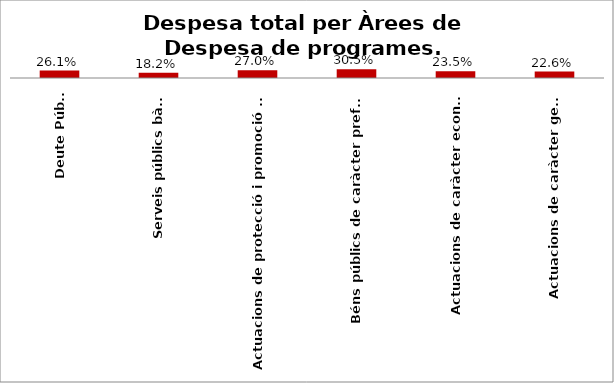
| Category | Series 0 |
|---|---|
| Deute Públic | 0.261 |
| Serveis públics bàsics | 0.182 |
| Actuacions de protecció i promoció social | 0.27 |
| Béns públics de caràcter preferent | 0.305 |
| Actuacions de caràcter econòmic | 0.235 |
| Actuacions de caràcter general | 0.226 |